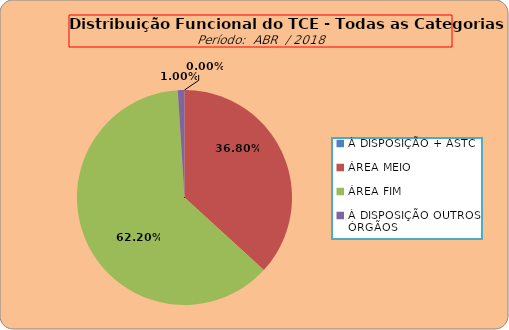
| Category | Series 0 |
|---|---|
| À DISPOSIÇÃO + ASTC | 0 |
| ÁREA MEIO | 184 |
| ÁREA FIM | 311 |
| À DISPOSIÇÃO OUTROS ÓRGÃOS | 5 |